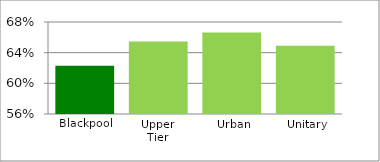
| Category | Series 1 |
|---|---|
| Blackpool | 0.623 |
| Upper Tier | 0.655 |
| Urban | 0.666 |
| Unitary | 0.649 |